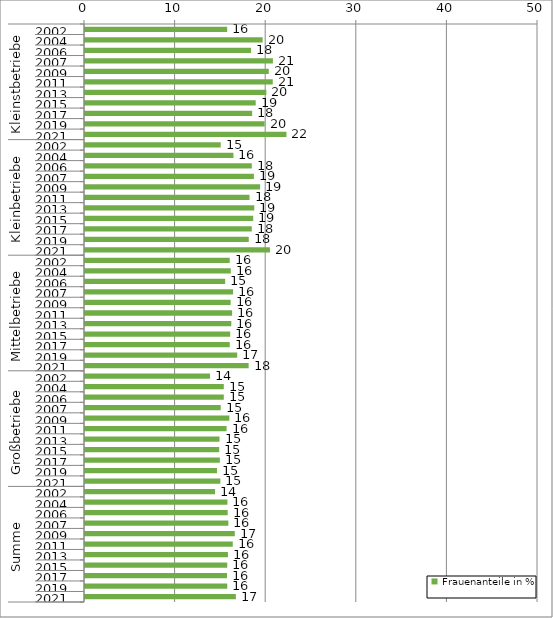
| Category | Frauenanteile in % |
|---|---|
| 0 | 15.693 |
| 1 | 19.605 |
| 2 | 18.327 |
| 3 | 20.741 |
| 4 | 20.286 |
| 5 | 20.725 |
| 6 | 20.015 |
| 7 | 18.841 |
| 8 | 18.449 |
| 9 | 19.826 |
| 10 | 22.235 |
| 11 | 14.98 |
| 12 | 16.385 |
| 13 | 18.411 |
| 14 | 18.644 |
| 15 | 19.33 |
| 16 | 18.161 |
| 17 | 18.687 |
| 18 | 18.566 |
| 19 | 18.409 |
| 20 | 18.074 |
| 21 | 20.415 |
| 22 | 15.972 |
| 23 | 16.09 |
| 24 | 15.471 |
| 25 | 16.344 |
| 26 | 16.074 |
| 27 | 16.236 |
| 28 | 16.148 |
| 29 | 16.026 |
| 30 | 15.979 |
| 31 | 16.8 |
| 32 | 18.06 |
| 33 | 13.804 |
| 34 | 15.321 |
| 35 | 15.321 |
| 36 | 14.979 |
| 37 | 15.929 |
| 38 | 15.628 |
| 39 | 14.847 |
| 40 | 14.812 |
| 41 | 14.886 |
| 42 | 14.569 |
| 43 | 14.941 |
| 44 | 14.356 |
| 45 | 15.721 |
| 46 | 15.748 |
| 47 | 15.822 |
| 48 | 16.535 |
| 49 | 16.31 |
| 50 | 15.777 |
| 51 | 15.699 |
| 52 | 15.675 |
| 53 | 15.7 |
| 54 | 16.65 |